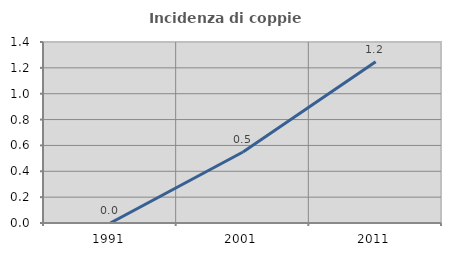
| Category | Incidenza di coppie miste |
|---|---|
| 1991.0 | 0 |
| 2001.0 | 0.549 |
| 2011.0 | 1.247 |